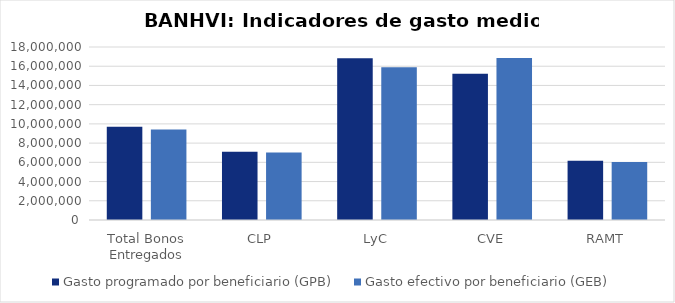
| Category | Gasto programado por beneficiario (GPB)  | Gasto efectivo por beneficiario (GEB)  |
|---|---|---|
| Total Bonos Entregados | 9713906.504 | 9425912.888 |
| CLP | 7108298.145 | 7017882.05 |
| LyC | 16818463.695 | 15886892.304 |
| CVE | 15212068.284 | 16860278.802 |
| RAMT | 6173402.049 | 6022635.284 |